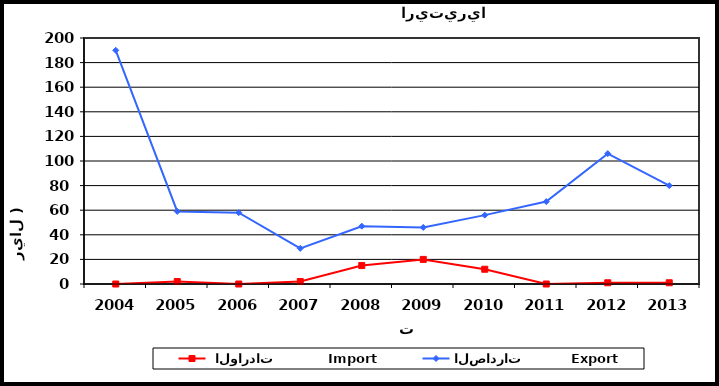
| Category |  الواردات           Import | الصادرات          Export |
|---|---|---|
| 2004.0 | 0 | 190 |
| 2005.0 | 2 | 59 |
| 2006.0 | 0 | 58 |
| 2007.0 | 2 | 29 |
| 2008.0 | 15 | 47 |
| 2009.0 | 20 | 46 |
| 2010.0 | 12 | 56 |
| 2011.0 | 0 | 67 |
| 2012.0 | 1 | 106 |
| 2013.0 | 1 | 80 |